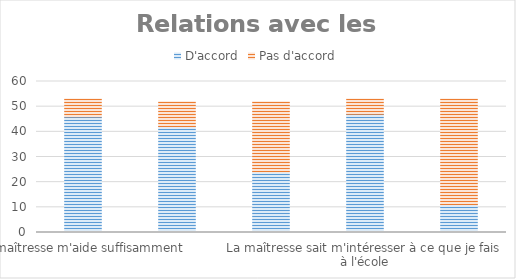
| Category | D'accord | Pas d'accord |
|---|---|---|
| La maîtresse m'aide suffisamment | 46 | 7 |
| La maîtresse me félicite | 42 | 10 |
| J'aimerais que la maîtresse m'explique plus les choses difficiles | 24 | 28 |
| La maîtresse sait m'intéresser à ce que je fais à l'école | 47 | 6 |
| La maîtresse a du mal à faire respecter les règles de la classe | 11 | 42 |